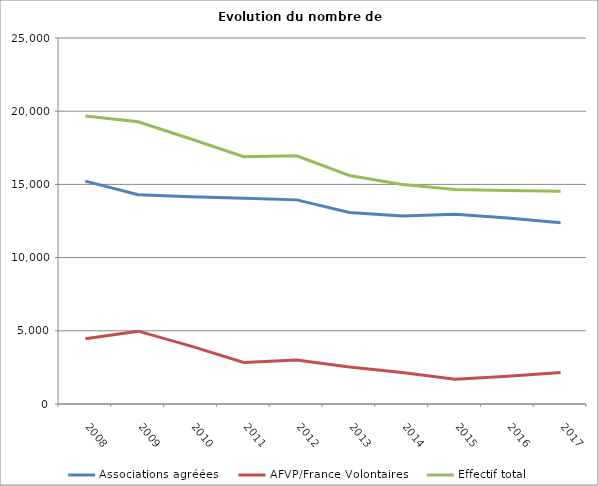
| Category | Associations agréées | AFVP/France Volontaires | Effectif total |
|---|---|---|---|
| 2008.0 | 15222 | 4453 | 19675 |
| 2009.0 | 14299 | 4975 | 19274 |
| 2010.0 | 14153 | 3950 | 18103 |
| 2011.0 | 14052 | 2840 | 16892 |
| 2012.0 | 13943 | 3009 | 16952 |
| 2013.0 | 13078 | 2531 | 15609 |
| 2014.0 | 12843 | 2144 | 14987 |
| 2015.0 | 12966 | 1693 | 14659 |
| 2016.0 | 12698 | 1893 | 14591 |
| 2017.0 | 12380 | 2150 | 14530 |